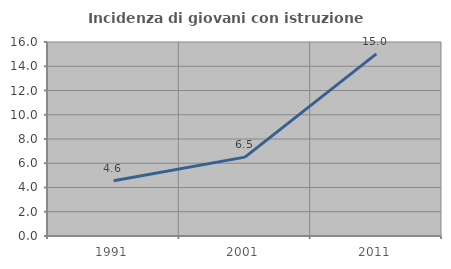
| Category | Incidenza di giovani con istruzione universitaria |
|---|---|
| 1991.0 | 4.559 |
| 2001.0 | 6.504 |
| 2011.0 | 15.017 |